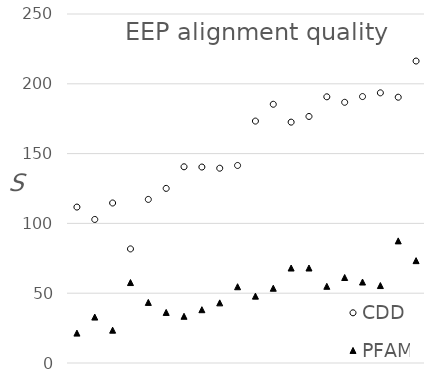
| Category | CDD | PFAM |
|---|---|---|
| 0 | 111.7 | 21.42 |
| 1 | 102.83 | 32.9 |
| 2 | 114.62 | 23.51 |
| 3 | 81.73 | 57.62 |
| 4 | 117.18 | 43.41 |
| 5 | 125.08 | 36.23 |
| 6 | 140.55 | 33.47 |
| 7 | 140.37 | 38.17 |
| 8 | 139.53 | 43.07 |
| 9 | 141.5 | 54.63 |
| 10 | 173.29 | 47.9 |
| 11 | 185.34 | 53.56 |
| 12 | 172.54 | 68.04 |
| 13 | 176.61 | 68.05 |
| 14 | 190.68 | 54.94 |
| 15 | 186.75 | 61.24 |
| 16 | 190.86 | 58 |
| 17 | 193.53 | 55.48 |
| 18 | 190.39 | 87.48 |
| 19 | 216.3 | 73.32 |